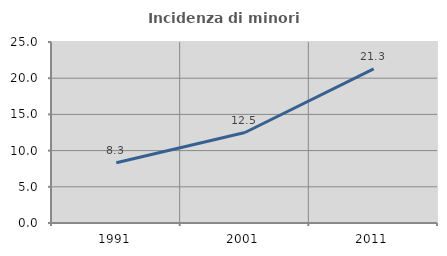
| Category | Incidenza di minori stranieri |
|---|---|
| 1991.0 | 8.333 |
| 2001.0 | 12.5 |
| 2011.0 | 21.277 |